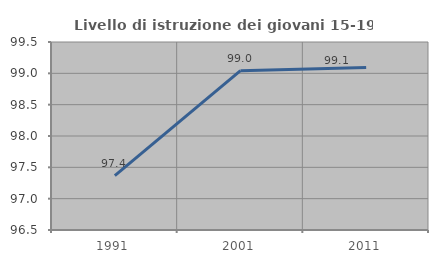
| Category | Livello di istruzione dei giovani 15-19 anni |
|---|---|
| 1991.0 | 97.368 |
| 2001.0 | 99.043 |
| 2011.0 | 99.095 |